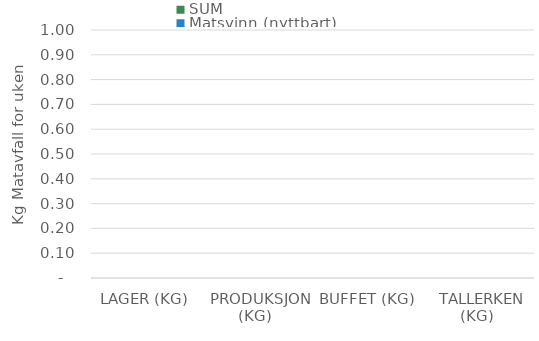
| Category | SUM | Matsvinn (nyttbart) |
|---|---|---|
|  LAGER (KG)  | 0 | 0 |
|  PRODUKSJON (KG)  | 0 | 0 |
|  BUFFET (KG)  | 0 | 0 |
|  TALLERKEN (KG)  | 0 | 0 |